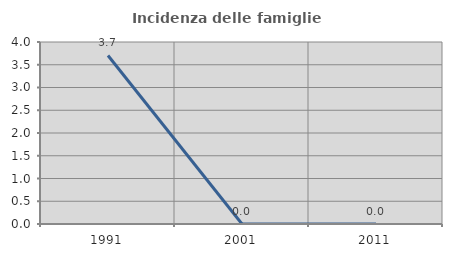
| Category | Incidenza delle famiglie numerose |
|---|---|
| 1991.0 | 3.704 |
| 2001.0 | 0 |
| 2011.0 | 0 |